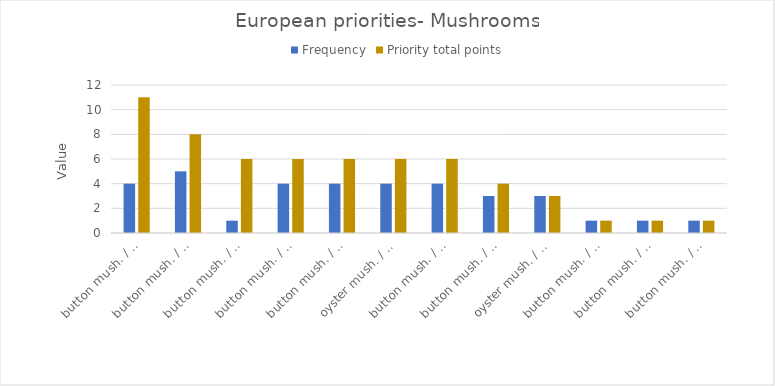
| Category | Frequency | Priority total points |
|---|---|---|
| button mush. / mildew  | 4 | 11 |
| button mush. / sciarid fly | 5 | 8 |
| button mush. / bacterial spot  | 1 | 6 |
| button mush. / brown spot  | 4 | 6 |
| button mush. / Trichoderma | 4 | 6 |
| oyster mush. / mushroom fly | 4 | 6 |
| button mush. / mushroom fly | 4 | 6 |
| button mush. / white mould  | 3 | 4 |
| oyster mush. / Lycoriella sciarid fly | 3 | 3 |
| button mush. / gnats | 1 | 1 |
| button mush. / Mycetophilidae | 1 | 1 |
| button mush. / sciarid fly | 1 | 1 |